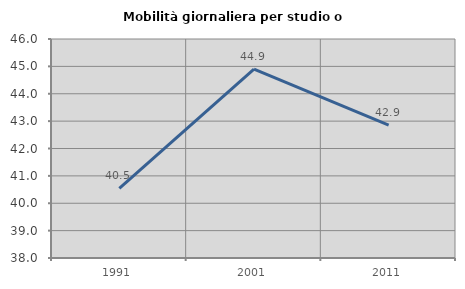
| Category | Mobilità giornaliera per studio o lavoro |
|---|---|
| 1991.0 | 40.541 |
| 2001.0 | 44.898 |
| 2011.0 | 42.857 |